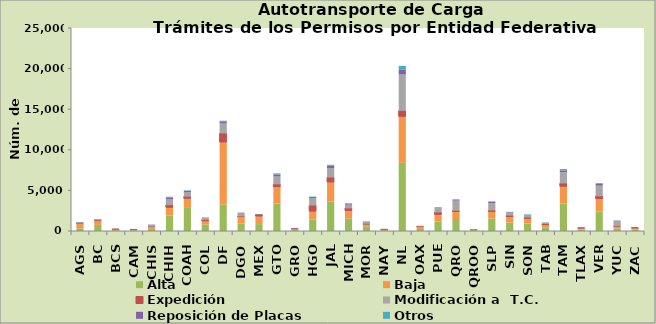
| Category | Alta                                         | Baja | Expedición | Modificación a  T.C. | Reposición de Placas | Otros |
|---|---|---|---|---|---|---|
| AGS | 335 | 562 | 34 | 91 | 51 | 18 |
| BC | 751 | 464 | 102 | 107 | 27 | 31 |
| BCS | 94 | 87 | 13 | 32 | 2 | 5 |
| CAM | 79 | 51 | 35 | 27 | 9 | 1 |
| CHIS | 267 | 227 | 42 | 224 | 16 | 29 |
| CHIH | 1896 | 971 | 324 | 753 | 136 | 139 |
| COAH | 2842 | 1139 | 254 | 510 | 215 | 50 |
| COL | 809 | 397 | 169 | 218 | 59 | 5 |
| DF | 3270 | 7636 | 1119 | 1204 | 189 | 163 |
| DGO | 923 | 800 | 76 | 376 | 77 | 12 |
| MEX | 853 | 938 | 218 | 41 | 22 | 17 |
| GTO | 3371 | 2031 | 347 | 954 | 265 | 131 |
| GRO | 135 | 115 | 37 | 28 | 16 | 1 |
| HGO | 1399 | 992 | 757 | 925 | 117 | 55 |
| JAL | 3614 | 2368 | 625 | 1154 | 319 | 76 |
| MICH | 1549 | 933 | 319 | 442 | 111 | 71 |
| MOR | 591 | 226 | 71 | 225 | 52 | 7 |
| NAY | 74 | 73 | 21 | 32 | 19 | 2 |
| NL | 8393 | 5675 | 739 | 4459 | 581 | 490 |
| OAX | 241 | 243 | 70 | 77 | 9 | 11 |
| PUE | 1177 | 823 | 288 | 518 | 94 | 25 |
| QRO | 1475 | 865 | 160 | 1235 | 147 | 17 |
| QROO | 76 | 46 | 39 | 81 | 7 | 1 |
| SLP | 1531 | 835 | 170 | 891 | 144 | 75 |
| SIN | 1038 | 697 | 164 | 364 | 68 | 24 |
| SON | 918 | 595 | 145 | 239 | 64 | 79 |
| TAB | 458 | 268 | 153 | 141 | 12 | 36 |
| TAM | 3398 | 2064 | 400 | 1370 | 241 | 158 |
| TLAX | 161 | 166 | 44 | 36 | 23 | 8 |
| VER | 2398 | 1533 | 361 | 1289 | 214 | 101 |
| YUC | 316 | 217 | 52 | 646 | 51 | 6 |
| ZAC | 205 | 153 | 28 | 12 | 4 | 0 |